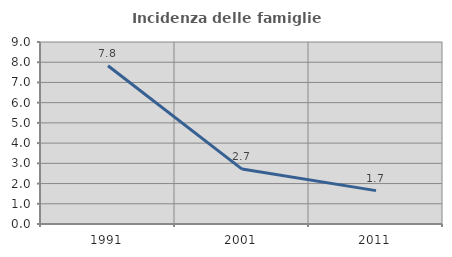
| Category | Incidenza delle famiglie numerose |
|---|---|
| 1991.0 | 7.825 |
| 2001.0 | 2.716 |
| 2011.0 | 1.651 |